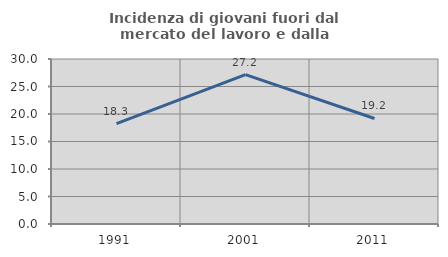
| Category | Incidenza di giovani fuori dal mercato del lavoro e dalla formazione  |
|---|---|
| 1991.0 | 18.261 |
| 2001.0 | 27.172 |
| 2011.0 | 19.187 |